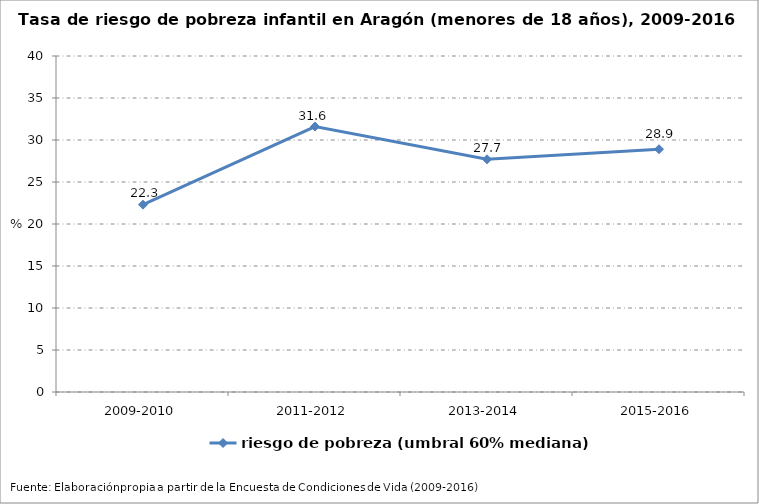
| Category | riesgo de pobreza (umbral 60% mediana) |
|---|---|
| 2009-2010 | 22.3 |
| 2011-2012 | 31.6 |
| 2013-2014 | 27.7 |
| 2015-2016 | 28.9 |